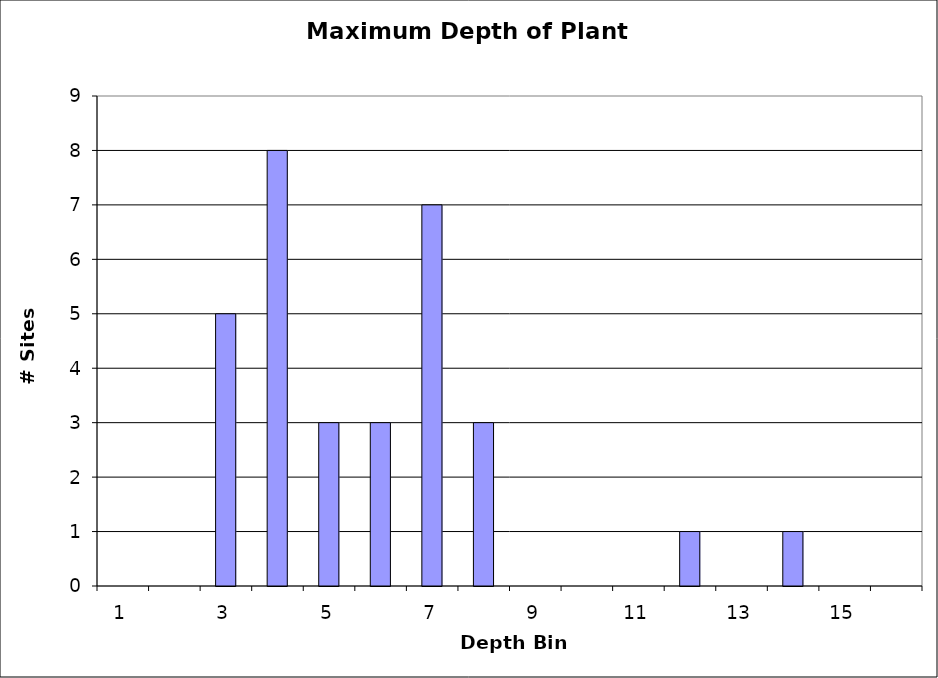
| Category | Series 0 |
|---|---|
| 1.0 | 0 |
| 2.0 | 0 |
| 3.0 | 5 |
| 4.0 | 8 |
| 5.0 | 3 |
| 6.0 | 3 |
| 7.0 | 7 |
| 8.0 | 3 |
| 9.0 | 0 |
| 10.0 | 0 |
| 11.0 | 0 |
| 12.0 | 1 |
| 13.0 | 0 |
| 14.0 | 1 |
| 15.0 | 0 |
| 16.0 | 0 |